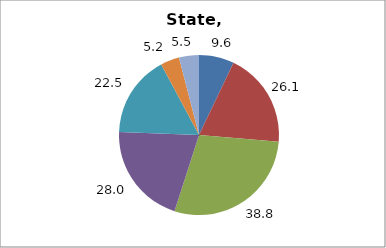
| Category | Series 0 |
|---|---|
| Higher Education | 9.649 |
| Elementary and Secondary Education | 26.116 |
| Total Education1 | 38.848 |
| Social Welfare2 | 28.014 |
| Transportation, Public Safety, Environment and Housing3 | 22.51 |
| Administration | 5.165 |
| Other4 | 5.463 |